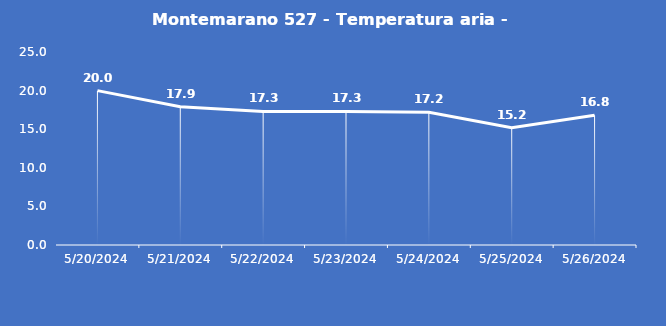
| Category | Montemarano 527 - Temperatura aria - Grezzo (°C) |
|---|---|
| 5/20/24 | 20 |
| 5/21/24 | 17.9 |
| 5/22/24 | 17.3 |
| 5/23/24 | 17.3 |
| 5/24/24 | 17.2 |
| 5/25/24 | 15.2 |
| 5/26/24 | 16.8 |